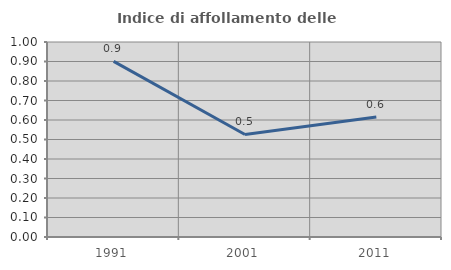
| Category | Indice di affollamento delle abitazioni  |
|---|---|
| 1991.0 | 0.9 |
| 2001.0 | 0.526 |
| 2011.0 | 0.616 |